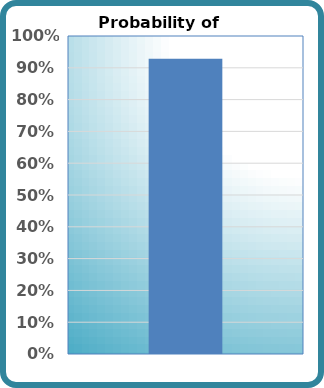
| Category | Probability of Success |
|---|---|
| 0 | 0.929 |